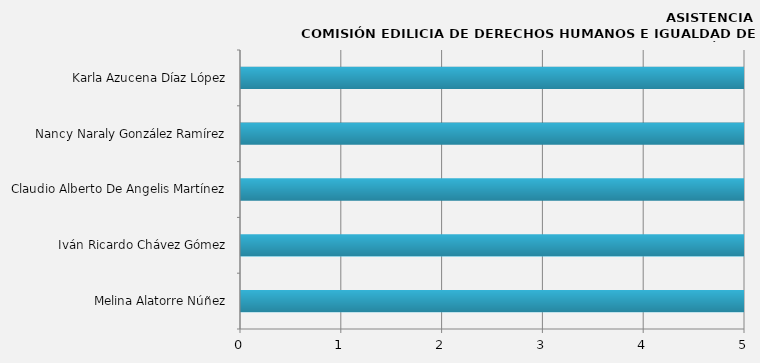
| Category | Series 0 |
|---|---|
| Melina Alatorre Núñez | 12 |
| Iván Ricardo Chávez Gómez | 10 |
| Claudio Alberto De Angelis Martínez | 11 |
| Nancy Naraly González Ramírez | 12 |
| Karla Azucena Díaz López | 6 |